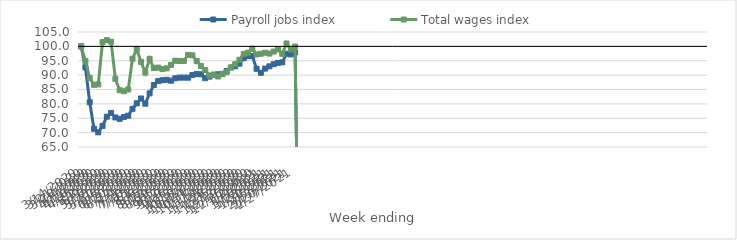
| Category | Payroll jobs index | Total wages index |
|---|---|---|
| 14/03/2020 | 100 | 100 |
| 21/03/2020 | 92.702 | 94.914 |
| 28/03/2020 | 80.581 | 89.004 |
| 04/04/2020 | 71.34 | 86.637 |
| 11/04/2020 | 70.107 | 86.756 |
| 18/04/2020 | 72.328 | 101.496 |
| 25/04/2020 | 75.546 | 102.199 |
| 02/05/2020 | 76.867 | 101.634 |
| 09/05/2020 | 75.279 | 88.712 |
| 16/05/2020 | 74.809 | 84.751 |
| 23/05/2020 | 75.458 | 84.408 |
| 30/05/2020 | 75.879 | 84.999 |
| 06/06/2020 | 78.272 | 95.694 |
| 13/06/2020 | 80.198 | 99.044 |
| 20/06/2020 | 81.881 | 94.601 |
| 27/06/2020 | 80.068 | 90.865 |
| 04/07/2020 | 83.653 | 95.638 |
| 11/07/2020 | 86.579 | 92.459 |
| 18/07/2020 | 87.923 | 92.624 |
| 25/07/2020 | 88.228 | 92.094 |
| 01/08/2020 | 88.374 | 92.355 |
| 08/08/2020 | 88.062 | 93.555 |
| 15/08/2020 | 88.888 | 95.009 |
| 22/08/2020 | 89.131 | 94.926 |
| 29/08/2020 | 89.133 | 94.934 |
| 05/09/2020 | 89.116 | 97.057 |
| 12/09/2020 | 90.024 | 96.885 |
| 19/09/2020 | 90.364 | 94.894 |
| 26/09/2020 | 90.298 | 93.213 |
| 03/10/2020 | 88.933 | 91.805 |
| 10/10/2020 | 89.486 | 89.87 |
| 17/10/2020 | 90.142 | 90.094 |
| 24/10/2020 | 90.291 | 89.512 |
| 31/10/2020 | 90.45 | 90.316 |
| 07/11/2020 | 91.428 | 91.054 |
| 14/11/2020 | 92.665 | 92.656 |
| 21/11/2020 | 93.086 | 93.795 |
| 28/11/2020 | 93.981 | 95.341 |
| 05/12/2020 | 95.884 | 97.393 |
| 12/12/2020 | 96.583 | 97.816 |
| 19/12/2020 | 96.673 | 99.212 |
| 26/12/2020 | 92.208 | 97.19 |
| 02/01/2021 | 90.801 | 97.427 |
| 09/01/2021 | 92.272 | 97.796 |
| 16/01/2021 | 93.054 | 97.504 |
| 23/01/2021 | 93.799 | 98.202 |
| 30/01/2021 | 94.246 | 98.929 |
| 06/02/2021 | 94.443 | 97.381 |
| 13/02/2021 | 97.438 | 101.002 |
| 20/02/2021 | 97.193 | 98.915 |
| 27/02/2021 | 97.866 | 99.946 |